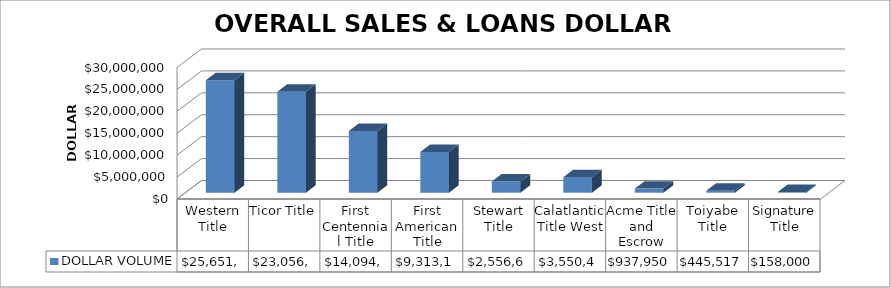
| Category | DOLLAR VOLUME |
|---|---|
| Western Title | 25651021.12 |
| Ticor Title | 23056195 |
| First Centennial Title | 14094569 |
| First American Title | 9313161 |
| Stewart Title | 2556620 |
| Calatlantic Title West | 3550413 |
| Acme Title and Escrow | 937950 |
| Toiyabe Title | 445517 |
| Signature Title | 158000 |